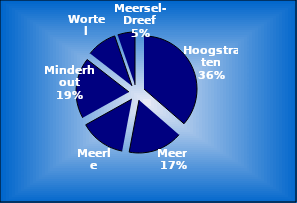
| Category | Series 0 |
|---|---|
| Hoogstraten | 7450 |
| Meer | 3397 |
| Meerle | 2853 |
| Minderhout | 3808 |
| Wortel | 1884 |
| Meersel-Dreef | 1085 |